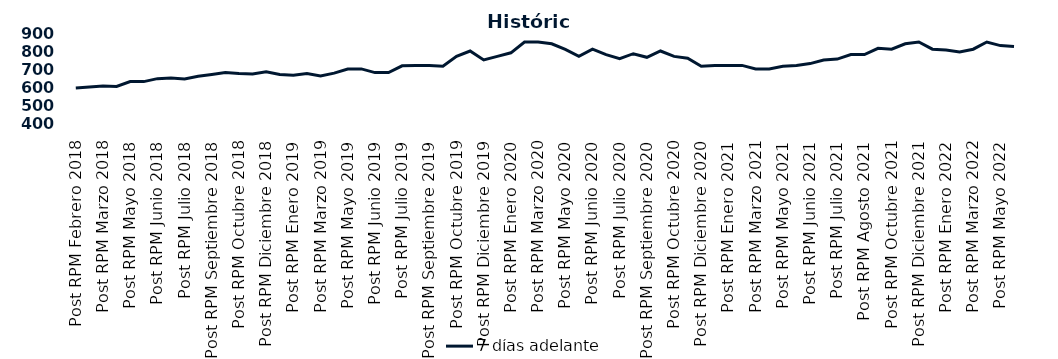
| Category | 7 días adelante  |
|---|---|
| Post RPM Febrero 2018 | 595 |
| Pre RPM Marzo 2018 | 600 |
| Post RPM Marzo 2018 | 605 |
| Pre RPM Mayo 2018 | 603 |
| Post RPM Mayo 2018 | 630 |
| Pre RPM Junio 2018 | 630 |
| Post RPM Junio 2018 | 646.5 |
| Pre RPM Julio 2018 | 650 |
| Post RPM Julio 2018 | 645 |
| Pre RPM Septiembre 2018 | 660 |
| Post RPM Septiembre 2018 | 670 |
| Pre RPM Octubre 2018 | 680 |
| Post RPM Octubre 2018 | 675 |
| Pre RPM Diciembre 2018 | 672.5 |
| Post RPM Diciembre 2018 | 685 |
| Pre RPM Enero 2019 | 670 |
| Post RPM Enero 2019 | 665 |
| Pre RPM Marzo 2019 | 675 |
| Post RPM Marzo 2019 | 661 |
| Pre RPM Mayo 2019 | 677 |
| Post RPM Mayo 2019 | 700 |
| Pre RPM Junio 2019 | 700.5 |
| Post RPM Junio 2019 | 680 |
| Pre RPM Julio 2019 | 680 |
| Post RPM Julio 2019 | 717.5 |
| Pre RPM Septiembre 2019 | 720 |
| Post RPM Septiembre 2019 | 720 |
| Pre RPM Octubre 2019 | 715 |
| Post RPM Octubre 2019 | 770 |
| Pre RPM Diciembre 2019 | 800 |
| Post RPM Diciembre 2019 | 750 |
| Pre RPM Enero 2020 | 770 |
| Post RPM Enero 2020 | 790 |
| Pre RPM Marzo 2020 | 850 |
| Post RPM Marzo 2020 | 850 |
| Pre RPM Mayo 2020 | 840 |
| Post RPM Mayo 2020 | 808.5 |
| Pre RPM Junio 2020 | 770 |
| Post RPM Junio 2020 | 810 |
| Pre RPM Julio 2020 | 780 |
| Post RPM Julio 2020 | 757 |
| Pre RPM Septiembre 2020 | 785 |
| Post RPM Septiembre 2020 | 765 |
| Pre RPM Octubre 2020 | 800 |
| Post RPM Octubre 2020 | 770 |
| Pre RPM Diciembre 2020 | 760 |
| Post RPM Diciembre 2020 | 715 |
| Pre RPM Enero 2021 | 720 |
| Post RPM Enero 2021 | 720 |
| Pre RPM Marzo 2021 | 720 |
| Post RPM Marzo 2021 | 700 |
| Pre RPM Mayo 2021 | 700 |
| Post RPM Mayo 2021 | 715 |
| Pre RPM Junio 2021 | 720 |
| Post RPM Junio 2021 | 730 |
| Pre RPM Julio 2021 | 750 |
| Post RPM Julio 2021 | 755 |
| Pre RPM Agosto 2021 | 780 |
| Post RPM Agosto 2021 | 780 |
| Pre RPM Octubre 2021 | 815 |
| Post RPM Octubre 2021 | 810 |
| Pre RPM Diciembre 2021 | 840 |
| Post RPM Diciembre 2021 | 850 |
| Pre RPM Enero 2022 | 810 |
| Post RPM Enero 2022 | 805 |
| Pre RPM Marzo 2022 | 795 |
| Post RPM Marzo 2022 | 810 |
| Pre RPM Mayo 2022 | 850 |
| Post RPM Mayo 2022 | 830 |
| Pre RPM Junio 2022 | 825 |